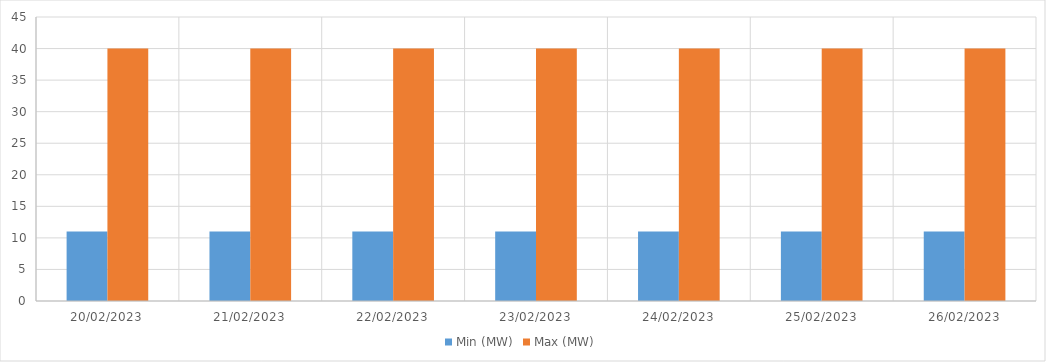
| Category | Min (MW) | Max (MW) |
|---|---|---|
| 20/02/2023 | 11 | 40 |
| 21/02/2023 | 11 | 40 |
| 22/02/2023 | 11 | 40 |
| 23/02/2023 | 11 | 40 |
| 24/02/2023 | 11 | 40 |
| 25/02/2023 | 11 | 40 |
| 26/02/2023 | 11 | 40 |